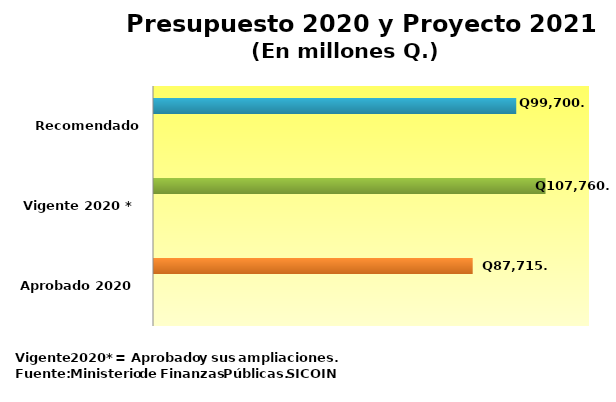
| Category | Series 0 | Series 2 | Series 3 |
|---|---|---|---|
| Aprobado 2020 |  |  | 87715 |
| Vigente 2020 * |  |  | 107760.7 |
| Recomendado 2021 |  |  | 99700 |